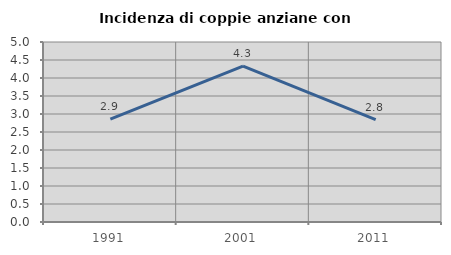
| Category | Incidenza di coppie anziane con figli |
|---|---|
| 1991.0 | 2.857 |
| 2001.0 | 4.327 |
| 2011.0 | 2.844 |